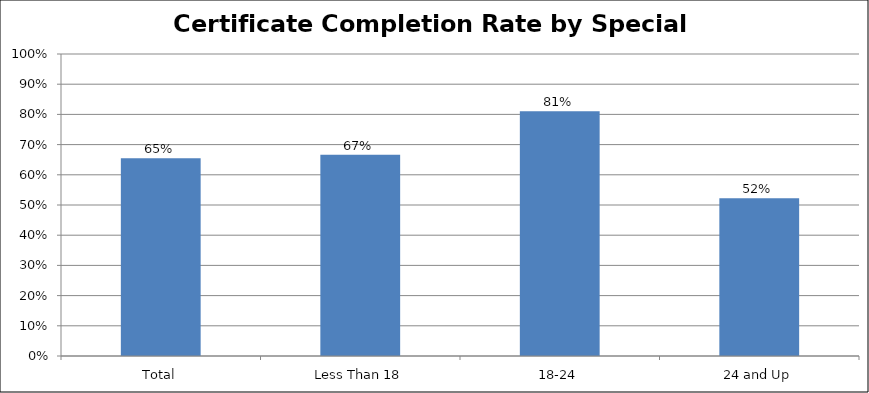
| Category | Certificate Completion by Age |
|---|---|
| Total | 0.655 |
| Less Than 18 | 0.667 |
| 18-24 | 0.811 |
| 24 and Up | 0.522 |